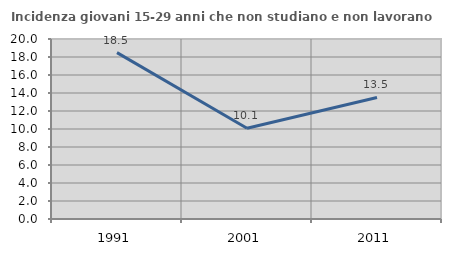
| Category | Incidenza giovani 15-29 anni che non studiano e non lavorano  |
|---|---|
| 1991.0 | 18.484 |
| 2001.0 | 10.091 |
| 2011.0 | 13.506 |